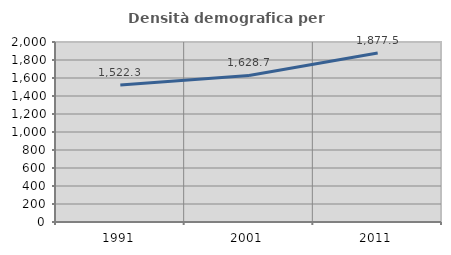
| Category | Densità demografica |
|---|---|
| 1991.0 | 1522.348 |
| 2001.0 | 1628.654 |
| 2011.0 | 1877.507 |